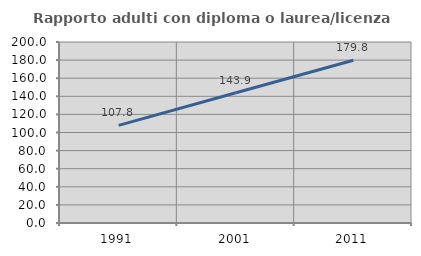
| Category | Rapporto adulti con diploma o laurea/licenza media  |
|---|---|
| 1991.0 | 107.814 |
| 2001.0 | 143.923 |
| 2011.0 | 179.826 |